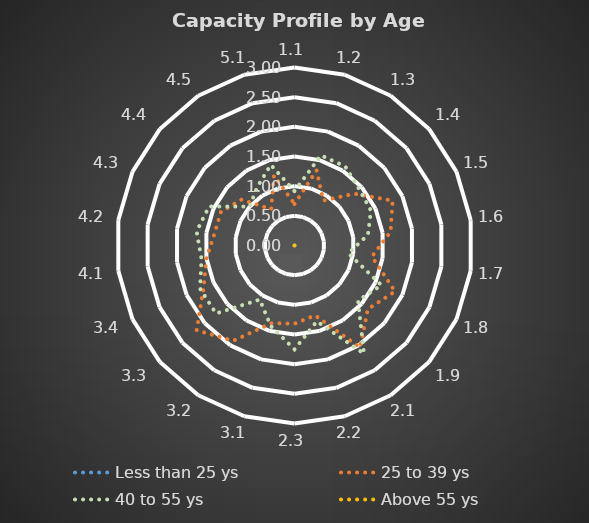
| Category | Less than 25 ys | 25 to 39 ys | 40 to 55 ys | Above 55 ys |
|---|---|---|---|---|
| 1.1 | 0 | 0.7 | 0.917 | 0 |
| 1.2 | 0 | 1.318 | 1.583 | 0 |
| 1.3 | 0 | 0.9 | 1.583 | 0 |
| 1.4 | 0 | 1.333 | 1.444 | 0 |
| 1.5 | 0 | 1.818 | 1.417 | 0 |
| 1.6 | 0 | 1.636 | 1.25 | 0 |
| 1.7 | 0 | 1.318 | 0.917 | 0 |
| 1.8 | 0 | 1.864 | 1.611 | 0 |
| 1.9 | 0 | 1.636 | 1.417 | 0 |
| 2.1 | 0 | 2.045 | 2.167 | 0 |
| 2.2 | 0 | 1.227 | 1.333 | 0 |
| 2.3 | 0 | 1.318 | 1.75 | 0 |
| 3.1 | 0 | 1.364 | 1.417 | 0 |
| 3.2 | 0 | 1.909 | 1.083 | 0 |
| 3.3 | 0 | 2.182 | 1.75 | 0 |
| 3.4 | 0 | 1.682 | 1.75 | 0 |
| 4.1 | 0 | 1.5 | 1.583 | 0 |
| 4.2 | 0 | 1.364 | 1.667 | 0 |
| 4.3 | 0 | 1.364 | 1.583 | 0 |
| 4.4 | 0 | 1.182 | 1 | 0 |
| 4.5 | 0 | 0.727 | 1.167 | 0 |
| 5.1 | 0 | 1.227 | 1.417 | 0 |